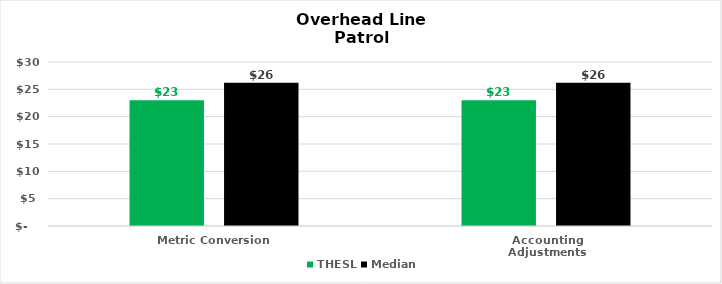
| Category | THESL | Median |
|---|---|---|
| Metric Conversion | 23 | 26.195 |
| Accounting Adjustments | 23 | 26.195 |